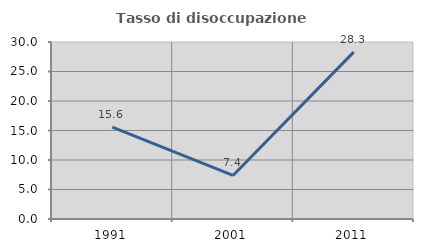
| Category | Tasso di disoccupazione giovanile  |
|---|---|
| 1991.0 | 15.566 |
| 2001.0 | 7.377 |
| 2011.0 | 28.283 |